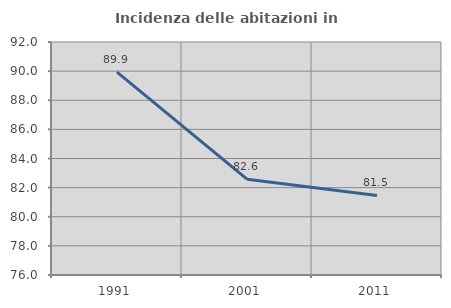
| Category | Incidenza delle abitazioni in proprietà  |
|---|---|
| 1991.0 | 89.933 |
| 2001.0 | 82.581 |
| 2011.0 | 81.461 |